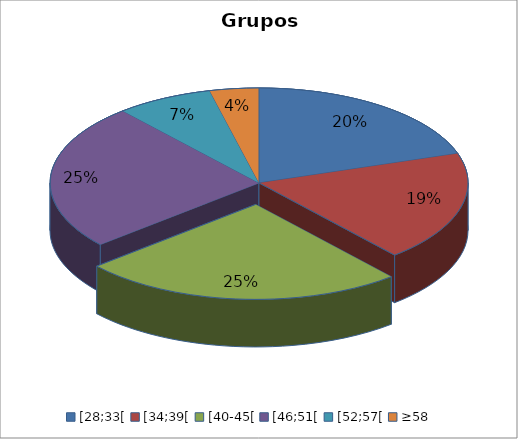
| Category | Series 0 |
|---|---|
| [28;33[ | 0.2 |
| [34;39[ | 0.188 |
| [40-45[ | 0.25 |
| [46;51[ | 0.25 |
| [52;57[ | 0.075 |
| ≥58 | 0.038 |